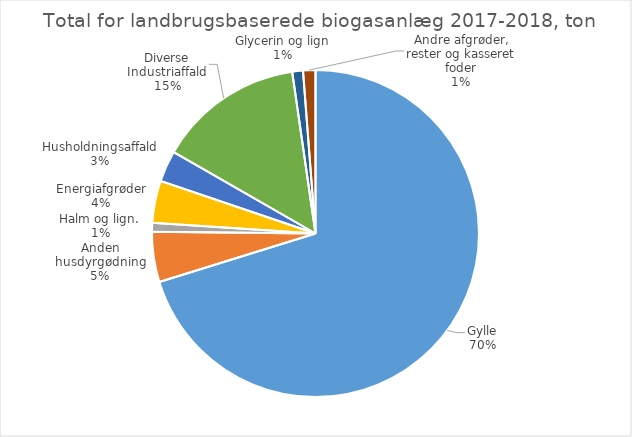
| Category | Series 0 |
|---|---|
| Gylle | 5716896.759 |
| Anden husdyrgødning | 403842.07 |
| Halm og lign.  | 71518.55 |
| Energiafgrøder | 338603.15 |
| Husholdningsaffald | 251622.2 |
| Diverse Industriaffald | 1174592.84 |
| Glycerin og lign | 86406.46 |
| Andre afgrøder, rester og kasseret foder | 99352.883 |